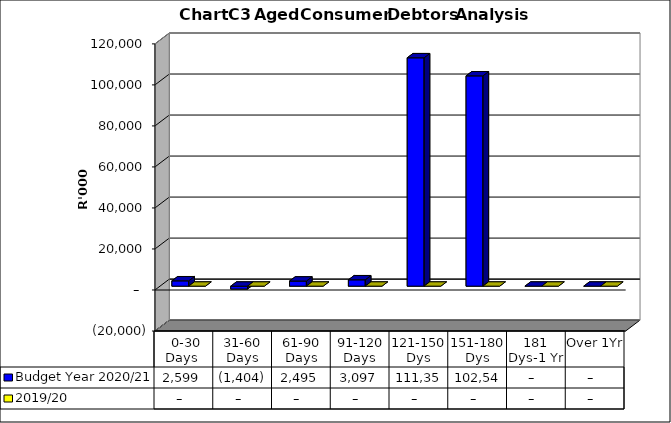
| Category | Budget Year 2020/21 | 2019/20 |
|---|---|---|
|  0-30 Days  | 2599315.27 | 0 |
| 31-60 Days | -1404219.1 | 0 |
| 61-90 Days | 2494735.32 | 0 |
| 91-120 Days | 3097365.57 | 0 |
| 121-150 Dys | 111354326.08 | 0 |
| 151-180 Dys | 102548172.69 | 0 |
| 181 Dys-1 Yr | 0 | 0 |
| Over 1Yr | 0 | 0 |